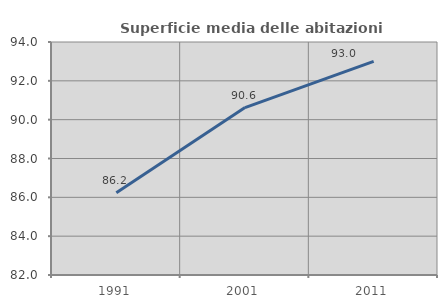
| Category | Superficie media delle abitazioni occupate |
|---|---|
| 1991.0 | 86.239 |
| 2001.0 | 90.621 |
| 2011.0 | 93.002 |